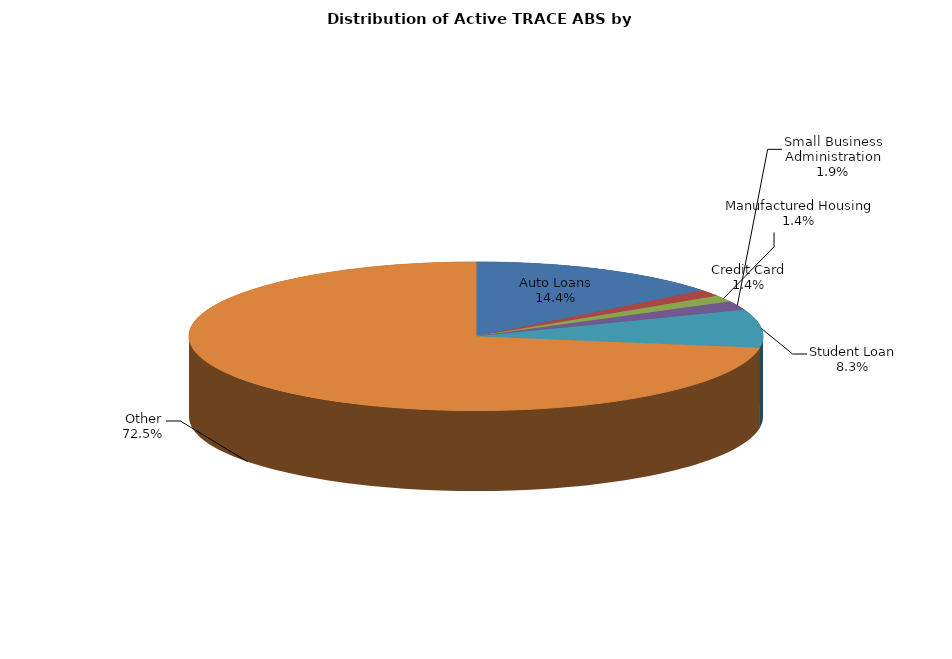
| Category | Series 0 |
|---|---|
| Auto Loans | 2548 |
| Credit Card | 246 |
| Manufactured Housing | 250 |
| Small Business Administration | 343 |
| Student Loan | 1461 |
| Other | 12803 |